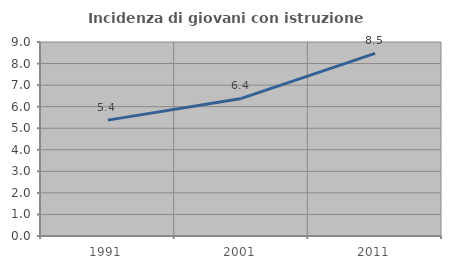
| Category | Incidenza di giovani con istruzione universitaria |
|---|---|
| 1991.0 | 5.376 |
| 2001.0 | 6.383 |
| 2011.0 | 8.475 |